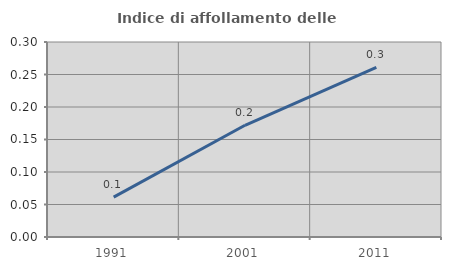
| Category | Indice di affollamento delle abitazioni  |
|---|---|
| 1991.0 | 0.061 |
| 2001.0 | 0.172 |
| 2011.0 | 0.261 |